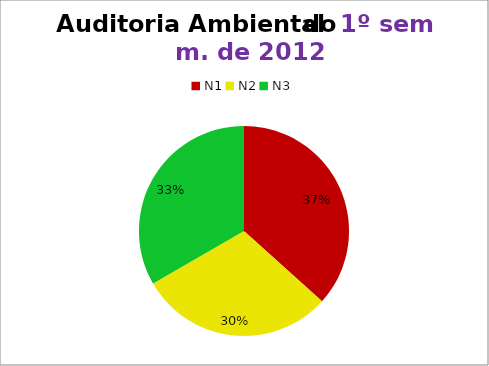
| Category | 1º/12 |
|---|---|
| N1 | 11 |
| N2 | 9 |
| N3 | 10 |